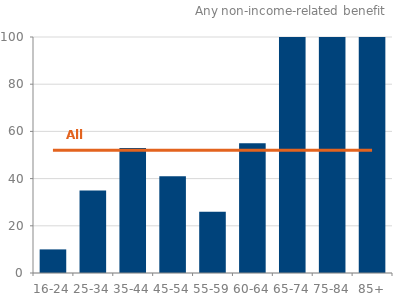
| Category | Series 0 |
|---|---|
| 0 | 10 |
| 1 | 35 |
| 2 | 53 |
| 3 | 41 |
| 4 | 26 |
| 5 | 55 |
| 6 | 100 |
| 7 | 100 |
| 8 | 100 |